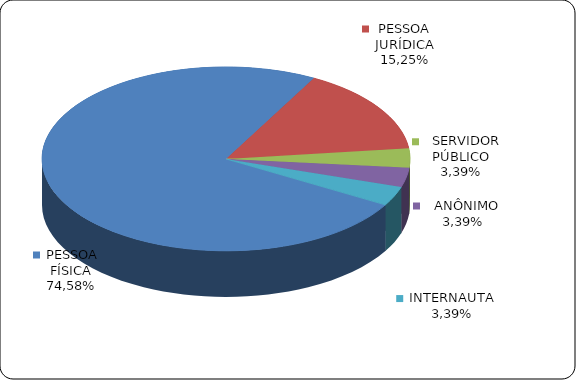
| Category | Series 0 |
|---|---|
|      PESSOA FÍSICA | 0.746 |
|      PESSOA JURÍDICA | 0.152 |
|      SERVIDOR PÚBLICO | 0.034 |
|      ANÔNIMO | 0.034 |
|      INTERNAUTA | 0.034 |